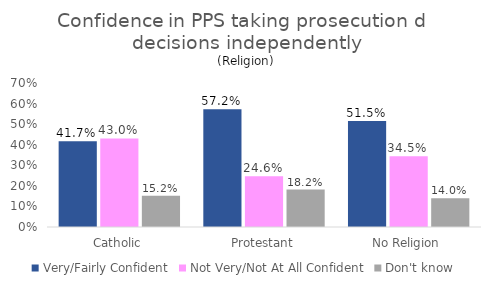
| Category | Very/Fairly Confident | Not Very/Not At All Confident | Don't know |
|---|---|---|---|
| Catholic | 0.417 | 0.43 | 0.152 |
| Protestant | 0.572 | 0.246 | 0.182 |
| No Religion | 0.515 | 0.345 | 0.14 |